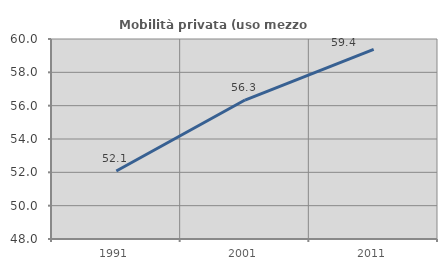
| Category | Mobilità privata (uso mezzo privato) |
|---|---|
| 1991.0 | 52.083 |
| 2001.0 | 56.338 |
| 2011.0 | 59.375 |